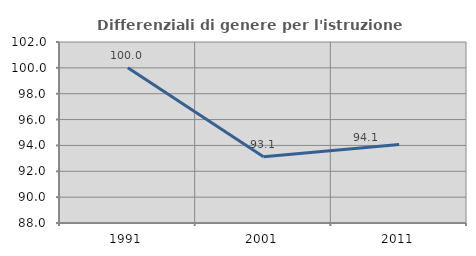
| Category | Differenziali di genere per l'istruzione superiore |
|---|---|
| 1991.0 | 100.016 |
| 2001.0 | 93.127 |
| 2011.0 | 94.07 |